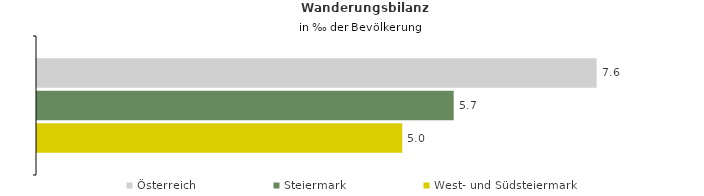
| Category | Österreich | Steiermark | West- und Südsteiermark |
|---|---|---|---|
| Wanderungsrate in ‰ der Bevölkerung, Periode 2014-2018 | 7.62 | 5.673 | 4.974 |